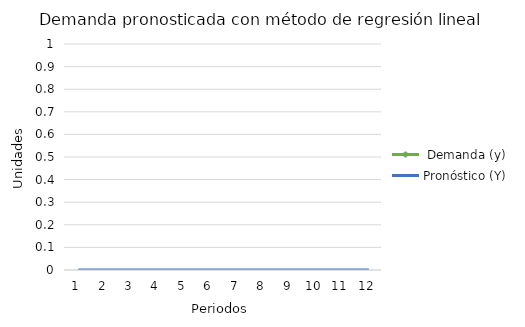
| Category |  Demanda (y) | Pronóstico (Y) |
|---|---|---|
| 0 |  | 0 |
| 1 |  | 0 |
| 2 |  | 0 |
| 3 |  | 0 |
| 4 |  | 0 |
| 5 |  | 0 |
| 6 |  | 0 |
| 7 |  | 0 |
| 8 |  | 0 |
| 9 |  | 0 |
| 10 |  | 0 |
| 11 |  | 0 |